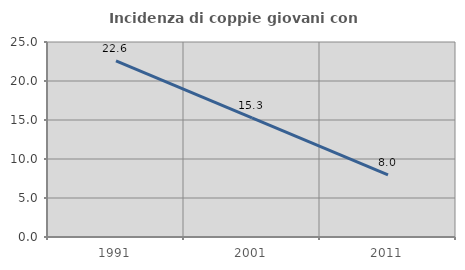
| Category | Incidenza di coppie giovani con figli |
|---|---|
| 1991.0 | 22.585 |
| 2001.0 | 15.281 |
| 2011.0 | 7.956 |